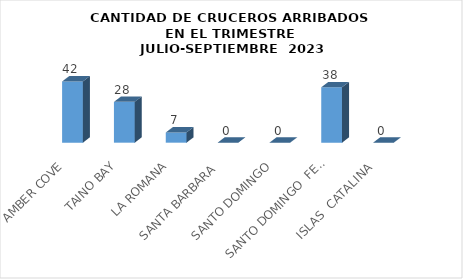
| Category | Series 0 |
|---|---|
| AMBER COVE | 42 |
| TAINO BAY | 28 |
| LA ROMANA | 7 |
| SANTA BARBARA  | 0 |
| SANTO DOMINGO | 0 |
| SANTO DOMINGO  FERRY | 38 |
| ISLAS  CATALINA  | 0 |